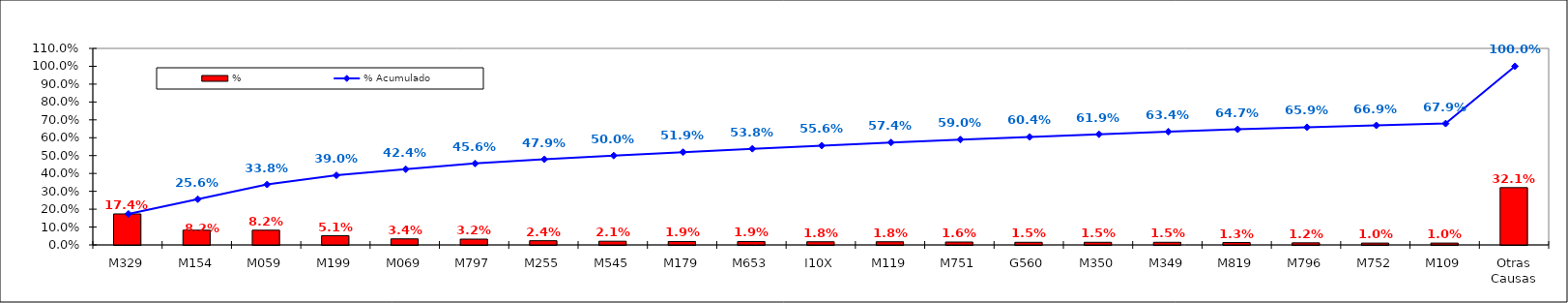
| Category | % |
|---|---|
| M329 | 0.174 |
| M154 | 0.082 |
| M059 | 0.082 |
| M199 | 0.051 |
| M069 | 0.034 |
| M797 | 0.032 |
| M255 | 0.024 |
| M545 | 0.021 |
| M179 | 0.019 |
| M653 | 0.019 |
| I10X | 0.018 |
| M119 | 0.018 |
| M751 | 0.016 |
| G560 | 0.015 |
| M350 | 0.015 |
| M349 | 0.015 |
| M819 | 0.013 |
| M796 | 0.012 |
| M752 | 0.01 |
| M109 | 0.01 |
| Otras Causas | 0.321 |